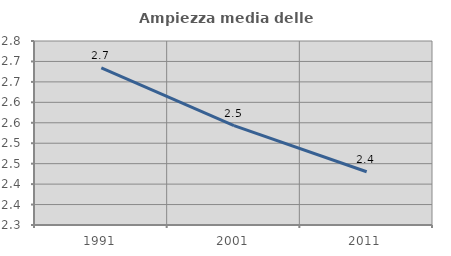
| Category | Ampiezza media delle famiglie |
|---|---|
| 1991.0 | 2.684 |
| 2001.0 | 2.543 |
| 2011.0 | 2.43 |